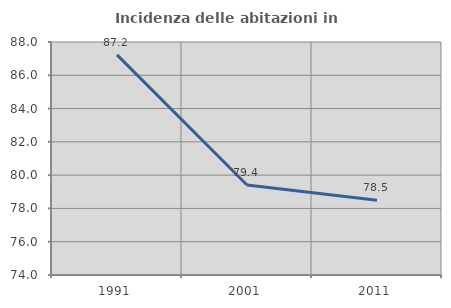
| Category | Incidenza delle abitazioni in proprietà  |
|---|---|
| 1991.0 | 87.229 |
| 2001.0 | 79.409 |
| 2011.0 | 78.489 |